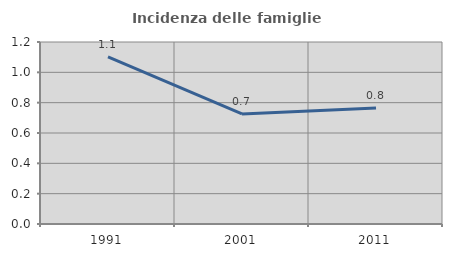
| Category | Incidenza delle famiglie numerose |
|---|---|
| 1991.0 | 1.102 |
| 2001.0 | 0.725 |
| 2011.0 | 0.765 |